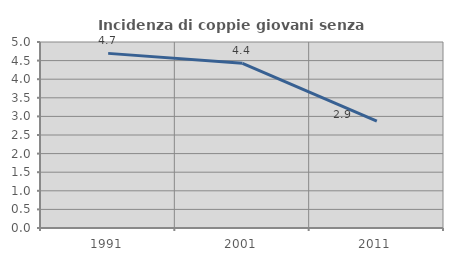
| Category | Incidenza di coppie giovani senza figli |
|---|---|
| 1991.0 | 4.694 |
| 2001.0 | 4.426 |
| 2011.0 | 2.876 |